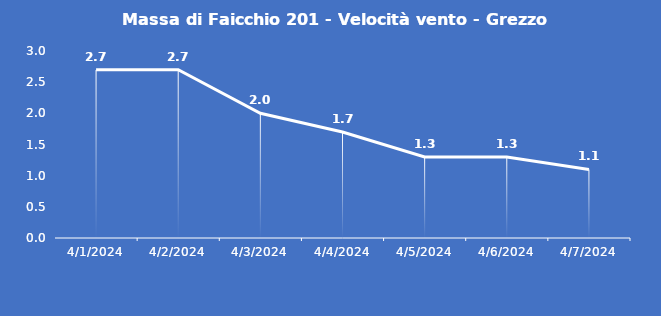
| Category | Massa di Faicchio 201 - Velocità vento - Grezzo (m/s) |
|---|---|
| 4/1/24 | 2.7 |
| 4/2/24 | 2.7 |
| 4/3/24 | 2 |
| 4/4/24 | 1.7 |
| 4/5/24 | 1.3 |
| 4/6/24 | 1.3 |
| 4/7/24 | 1.1 |